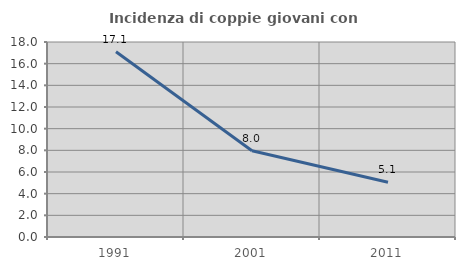
| Category | Incidenza di coppie giovani con figli |
|---|---|
| 1991.0 | 17.101 |
| 2001.0 | 7.969 |
| 2011.0 | 5.057 |